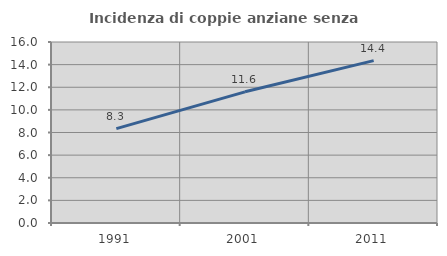
| Category | Incidenza di coppie anziane senza figli  |
|---|---|
| 1991.0 | 8.347 |
| 2001.0 | 11.596 |
| 2011.0 | 14.352 |